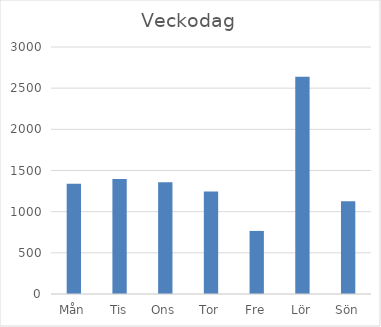
| Category | Summa |
|---|---|
| Mån | 1339 |
| Tis | 1396 |
| Ons | 1356 |
| Tor | 1246 |
| Fre | 766 |
| Lör | 2640 |
| Sön | 1128 |